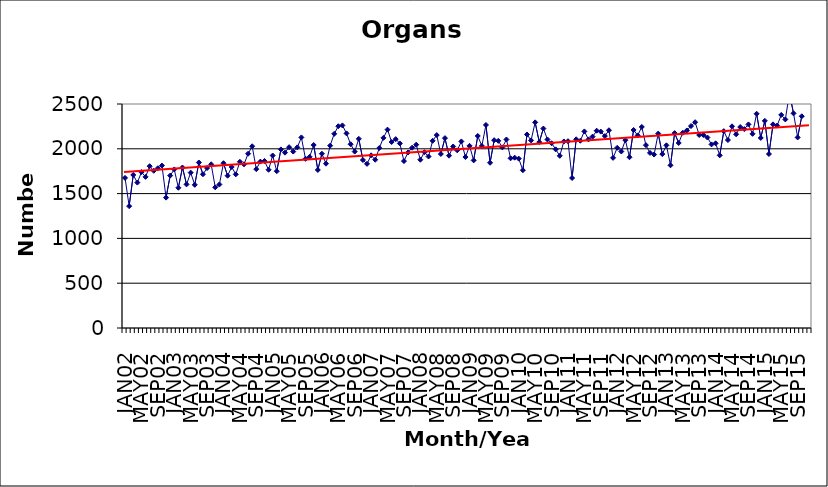
| Category | Series 0 |
|---|---|
| JAN02 | 1675 |
| FEB02 | 1360 |
| MAR02 | 1708 |
| APR02 | 1623 |
| MAY02 | 1740 |
| JUN02 | 1687 |
| JUL02 | 1806 |
| AUG02 | 1755 |
| SEP02 | 1783 |
| OCT02 | 1813 |
| NOV02 | 1455 |
| DEC02 | 1701 |
| JAN03 | 1770 |
| FEB03 | 1565 |
| MAR03 | 1791 |
| APR03 | 1603 |
| MAY03 | 1734 |
| JUN03 | 1598 |
| JUL03 | 1847 |
| AUG03 | 1716 |
| SEP03 | 1785 |
| OCT03 | 1827 |
| NOV03 | 1570 |
| DEC03 | 1602 |
| JAN04 | 1839 |
| FEB04 | 1700 |
| MAR04 | 1797 |
| APR04 | 1715 |
| MAY04 | 1855 |
| JUN04 | 1827 |
| JUL04 | 1945 |
| AUG04 | 2028 |
| SEP04 | 1773 |
| OCT04 | 1857 |
| NOV04 | 1864 |
| DEC04 | 1766 |
| JAN05 | 1925 |
| FEB05 | 1750 |
| MAR05 | 1993 |
| APR05 | 1957 |
| MAY05 | 2018 |
| JUN05 | 1969 |
| JUL05 | 2016 |
| AUG05 | 2127 |
| SEP05 | 1888 |
| OCT05 | 1910 |
| NOV05 | 2042 |
| DEC05 | 1764 |
| JAN06 | 1945 |
| FEB06 | 1834 |
| MAR06 | 2035 |
| APR06 | 2167 |
| MAY06 | 2252 |
| JUN06 | 2261 |
| JUL06 | 2172 |
| AUG06 | 2051 |
| SEP06 | 1969 |
| OCT06 | 2111 |
| NOV06 | 1875 |
| DEC06 | 1832 |
| JAN07 | 1927 |
| FEB07 | 1878 |
| MAR07 | 2009 |
| APR07 | 2122 |
| MAY07 | 2214 |
| JUN07 | 2076 |
| JUL07 | 2108 |
| AUG07 | 2060 |
| SEP07 | 1863 |
| OCT07 | 1959 |
| NOV07 | 2012 |
| DEC07 | 2046 |
| JAN08 | 1878 |
| FEB08 | 1962 |
| MAR08 | 1914 |
| APR08 | 2089 |
| MAY08 | 2153 |
| JUN08 | 1942 |
| JUL08 | 2119 |
| AUG08 | 1923 |
| SEP08 | 2026 |
| OCT08 | 1983 |
| NOV08 | 2082 |
| DEC08 | 1908 |
| JAN09 | 2033 |
| FEB09 | 1871 |
| MAR09 | 2143 |
| APR09 | 2032 |
| MAY09 | 2266 |
| JUN09 | 1844 |
| JUL09 | 2096 |
| AUG09 | 2089 |
| SEP09 | 2016 |
| OCT09 | 2104 |
| NOV09 | 1894 |
| DEC09 | 1901 |
| JAN10 | 1890 |
| FEB10 | 1761 |
| MAR10 | 2160 |
| APR10 | 2094 |
| MAY10 | 2295 |
| JUN10 | 2075 |
| JUL10 | 2226 |
| AUG10 | 2104 |
| SEP10 | 2062 |
| OCT10 | 1994 |
| NOV10 | 1922 |
| DEC10 | 2082 |
| JAN11 | 2085 |
| FEB11 | 1674 |
| MAR11 | 2106 |
| APR11 | 2090 |
| MAY11 | 2194 |
| JUN11 | 2105 |
| JUL11 | 2136 |
| AUG11 | 2202 |
| SEP11 | 2192 |
| OCT11 | 2142 |
| NOV11 | 2207 |
| DEC11 | 1899 |
| JAN12 | 2011 |
| FEB12 | 1970 |
| MAR12 | 2096 |
| APR12 | 1906 |
| MAY12 | 2210 |
| JUN12 | 2150 |
| JUL12 | 2244 |
| AUG12 | 2041 |
| SEP12 | 1954 |
| OCT12 | 1936 |
| NOV12 | 2170 |
| DEC12 | 1941 |
| JAN13 | 2039 |
| FEB13 | 1816 |
| MAR13 | 2175 |
| APR13 | 2065 |
| MAY13 | 2179 |
| JUN13 | 2205 |
| JUL13 | 2254 |
| AUG13 | 2297 |
| SEP13 | 2154 |
| OCT13 | 2154 |
| NOV13 | 2126 |
| DEC13 | 2049 |
| JAN14 | 2061 |
| FEB14 | 1927 |
| MAR14 | 2197 |
| APR14 | 2098 |
| MAY14 | 2251 |
| JUN14 | 2162 |
| JUL14 | 2243 |
| AUG14 | 2220 |
| SEP14 | 2272 |
| OCT14 | 2167 |
| NOV14 | 2391 |
| DEC14 | 2121 |
| JAN15 | 2312 |
| FEB15 | 1942 |
| MAR15 | 2273 |
| APR15 | 2259 |
| MAY15 | 2378 |
| JUN15 | 2328 |
| JUL15 | 2619 |
| AUG15 | 2396 |
| SEP15 | 2127 |
| OCT15 | 2363 |